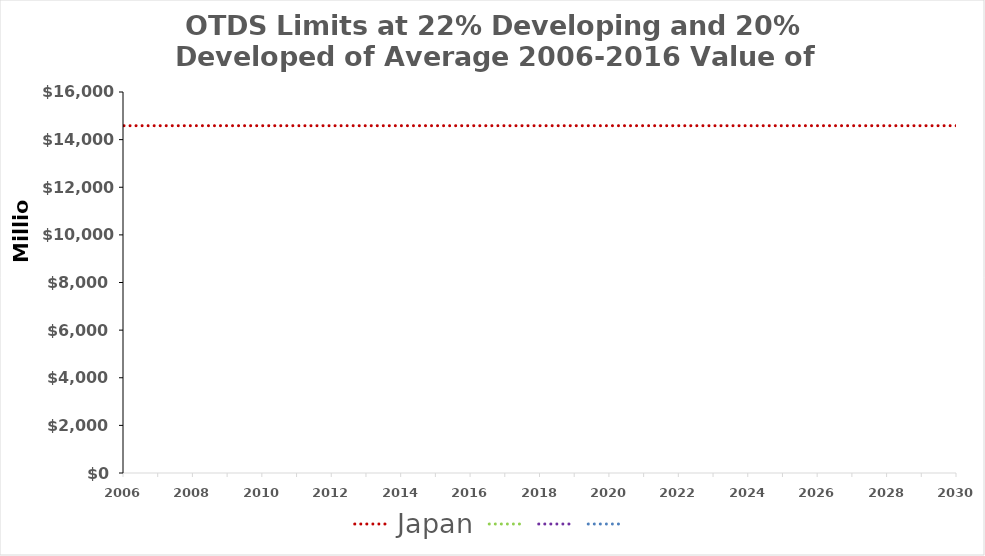
| Category | Japan | Series 3 | Series 4 | Series 0 |
|---|---|---|---|---|
| 2006.0 | 14584545984.157 |  |  |  |
| 2007.0 | 14584545984.157 |  |  |  |
| 2008.0 | 14584545984.157 |  |  |  |
| 2009.0 | 14584545984.157 |  |  |  |
| 2010.0 | 14584545984.157 |  |  |  |
| 2011.0 | 14584545984.157 |  |  |  |
| 2012.0 | 14584545984.157 |  |  |  |
| 2013.0 | 14584545984.157 |  |  |  |
| 2014.0 | 14584545984.157 |  |  |  |
| 2015.0 | 14584545984.157 |  |  |  |
| 2016.0 | 14584545984.157 |  |  |  |
| 2017.0 | 14584545984.157 |  |  |  |
| 2018.0 | 14584545984.157 |  |  |  |
| 2019.0 | 14584545984.157 |  |  |  |
| 2020.0 | 14584545984.157 |  |  |  |
| 2021.0 | 14584545984.157 |  |  |  |
| 2022.0 | 14584545984.157 |  |  |  |
| 2023.0 | 14584545984.157 |  |  |  |
| 2024.0 | 14584545984.157 |  |  |  |
| 2025.0 | 14584545984.157 |  |  |  |
| 2026.0 | 14584545984.157 |  |  |  |
| 2027.0 | 14584545984.157 |  |  |  |
| 2028.0 | 14584545984.157 |  |  |  |
| 2029.0 | 14584545984.157 |  |  |  |
| 2030.0 | 14584545984.157 |  |  |  |